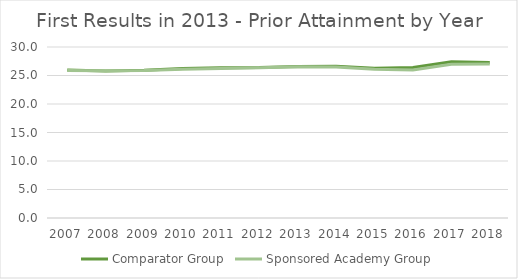
| Category | Comparator Group | Sponsored Academy Group |
|---|---|---|
| 2007.0 | 25.946 | 25.866 |
| 2008.0 | 25.806 | 25.84 |
| 2009.0 | 25.941 | 25.875 |
| 2010.0 | 26.229 | 26.077 |
| 2011.0 | 26.37 | 26.241 |
| 2012.0 | 26.404 | 26.358 |
| 2013.0 | 26.595 | 26.546 |
| 2014.0 | 26.626 | 26.508 |
| 2015.0 | 26.279 | 26.11 |
| 2016.0 | 26.386 | 25.976 |
| 2017.0 | 27.411 | 26.962 |
| 2018.0 | 27.269 | 27.021 |